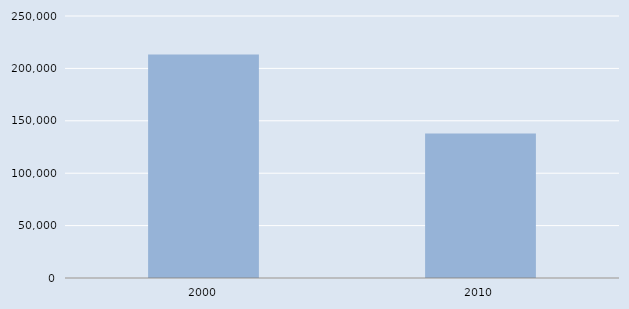
| Category | Series 0 |
|---|---|
| 2000.0 | 213203 |
| 2010.0 | 137973 |